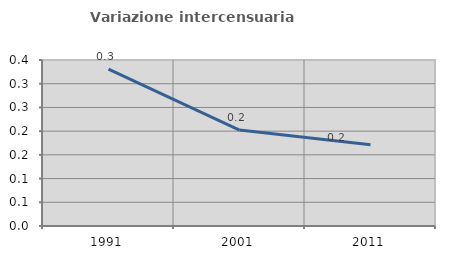
| Category | Variazione intercensuaria annua |
|---|---|
| 1991.0 | 0.331 |
| 2001.0 | 0.202 |
| 2011.0 | 0.171 |